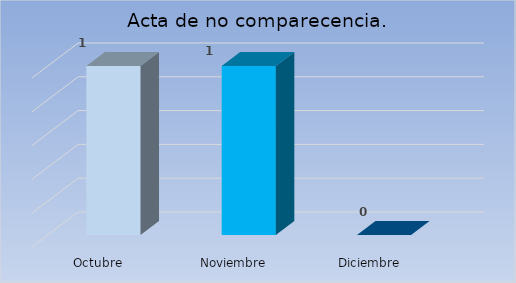
| Category | Acta de no comparecencia. |
|---|---|
| Octubre | 1 |
| Noviembre | 1 |
| Diciembre | 0 |